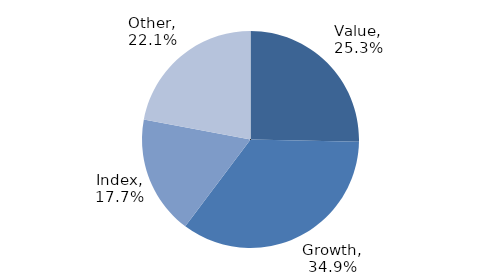
| Category | Investment Style |
|---|---|
| Value | 0.253 |
| Growth | 0.349 |
| Index | 0.177 |
| Other | 0.221 |